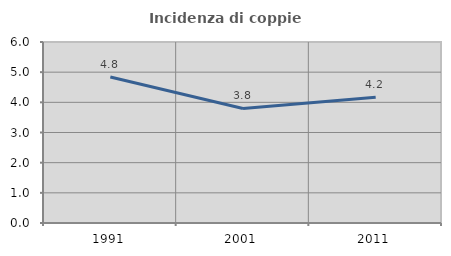
| Category | Incidenza di coppie miste |
|---|---|
| 1991.0 | 4.839 |
| 2001.0 | 3.797 |
| 2011.0 | 4.167 |